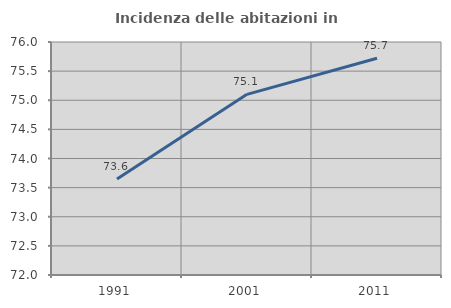
| Category | Incidenza delle abitazioni in proprietà  |
|---|---|
| 1991.0 | 73.65 |
| 2001.0 | 75.101 |
| 2011.0 | 75.722 |